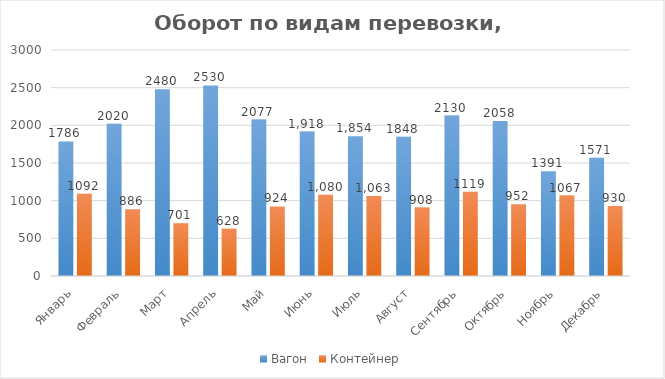
| Category | Вагон | Контейнер |
|---|---|---|
| Январь | 1786 | 1092 |
| Февраль | 2020 | 886 |
| Март | 2480 | 701 |
| Апрель | 2530 | 628 |
| Май | 2077 | 924 |
| Июнь | 1918 | 1080 |
| Июль | 1854 | 1063 |
| Август | 1848 | 908 |
| Сентябрь | 2130 | 1119 |
| Октябрь | 2058 | 952 |
| Ноябрь | 1391 | 1067 |
| Декабрь | 1571 | 930 |